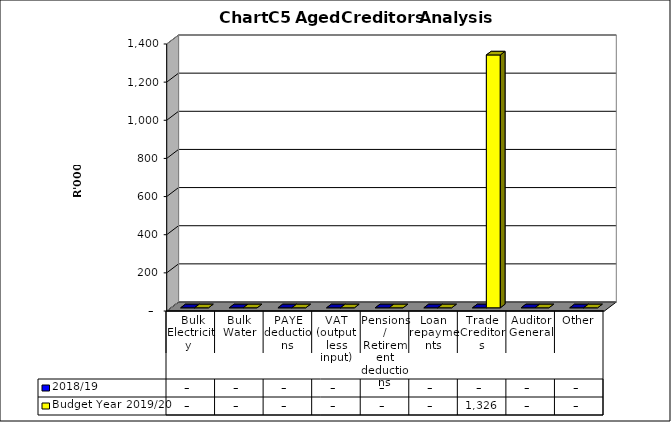
| Category | 2018/19 | Budget Year 2019/20 |
|---|---|---|
|  Bulk Electricity  | 0 | 0 |
| Bulk Water | 0 | 0 |
| PAYE deductions | 0 | 0 |
| VAT (output less input) | 0 | 0 |
| Pensions / Retirement deductions | 0 | 0 |
| Loan repayments | 0 | 0 |
| Trade Creditors | 0 | 1325826.25 |
| Auditor General | 0 | 0 |
| Other | 0 | 0 |